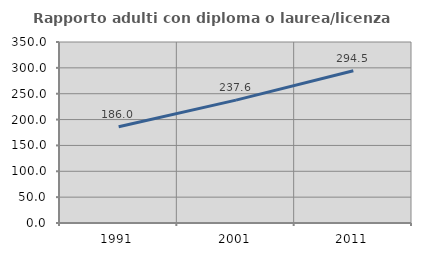
| Category | Rapporto adulti con diploma o laurea/licenza media  |
|---|---|
| 1991.0 | 186.041 |
| 2001.0 | 237.55 |
| 2011.0 | 294.484 |